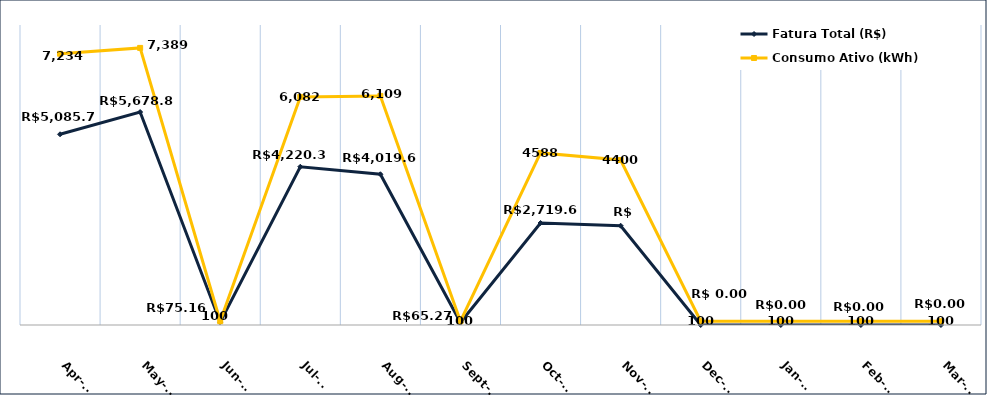
| Category | Fatura Total (R$) |
|---|---|
| 2022-04-01 | 5085.73 |
| 2022-05-01 | 5678.82 |
| 2022-06-01 | 75.16 |
| 2022-07-01 | 4220.31 |
| 2022-08-01 | 4019.63 |
| 2022-09-01 | 65.27 |
| 2022-10-01 | 2719.64 |
| 2022-11-01 | 2648.02 |
| 2022-12-01 | 0 |
| 2023-01-01 | 0 |
| 2023-02-01 | 0 |
| 2023-03-01 | 0 |